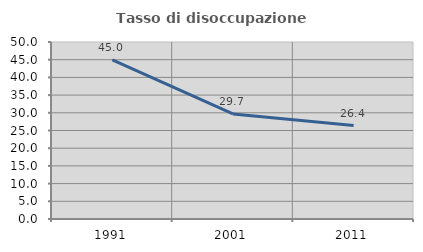
| Category | Tasso di disoccupazione giovanile  |
|---|---|
| 1991.0 | 44.972 |
| 2001.0 | 29.665 |
| 2011.0 | 26.404 |